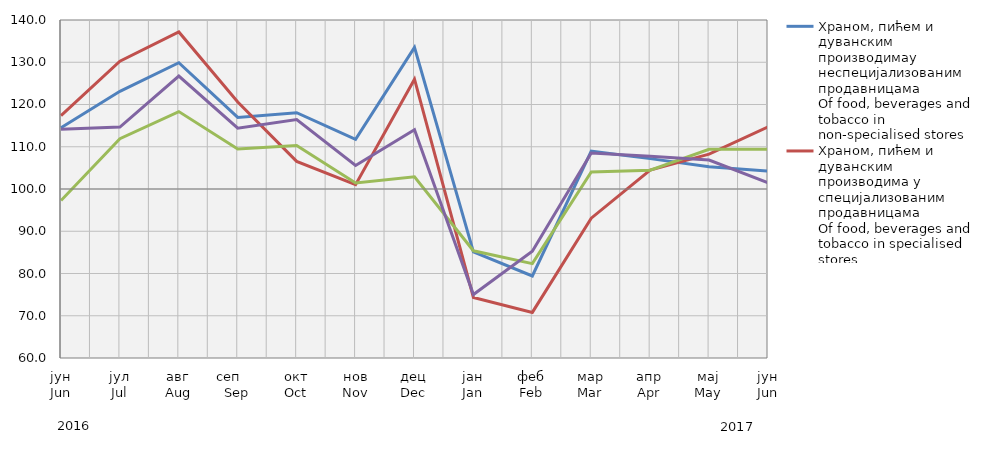
| Category | Храном, пићем и дуванским производимау неспецијализованим продавницама
Of food, beverages and tobacco in non-specialised stores
 | Храном, пићем и дуванским производима у специјализовaним продавницама
Of food, beverages and tobacco in specialised stores | Моторним горивима у специјализованим продавницама
Of motor fuels in specialised stores | Остала
Other |
|---|---|---|---|---|
| јун
Jun | 114.503 | 117.373 | 97.274 | 114.134 |
| јул
Jul | 123.119 | 130.235 | 111.897 | 114.647 |
| авг
Aug | 129.897 | 137.173 | 118.321 | 126.728 |
| сеп     Sep | 116.954 | 120.599 | 109.459 | 114.395 |
| окт
Oct | 118.057 | 106.539 | 110.286 | 116.429 |
| нов
Nov | 111.772 | 101.038 | 101.435 | 105.563 |
| дец
Dec | 133.518 | 125.992 | 102.88 | 114.01 |
| јан
Jan | 85.099 | 74.328 | 85.371 | 75.02 |
| феб
Feb | 79.418 | 70.792 | 82.332 | 85.25 |
| мар
Mar | 108.958 | 93.097 | 104.046 | 108.518 |
| апр
Apr | 107.187 | 104.456 | 104.458 | 107.78 |
| мај
May | 105.292 | 108.265 | 109.385 | 106.843 |
| јун
Jun | 104.266 | 114.686 | 109.425 | 101.464 |